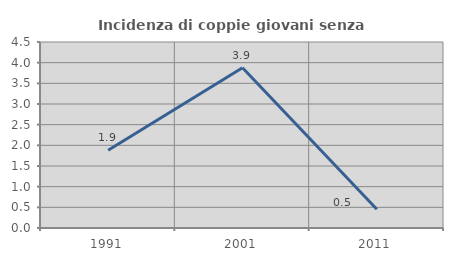
| Category | Incidenza di coppie giovani senza figli |
|---|---|
| 1991.0 | 1.879 |
| 2001.0 | 3.878 |
| 2011.0 | 0.456 |